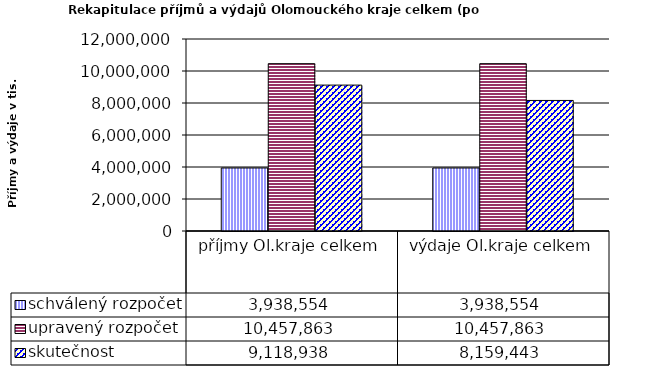
| Category | schválený rozpočet | upravený rozpočet | skutečnost |
|---|---|---|---|
| příjmy Ol.kraje celkem | 3938554 | 10457863 | 9118938 |
| výdaje Ol.kraje celkem | 3938554 | 10457863 | 8159443 |